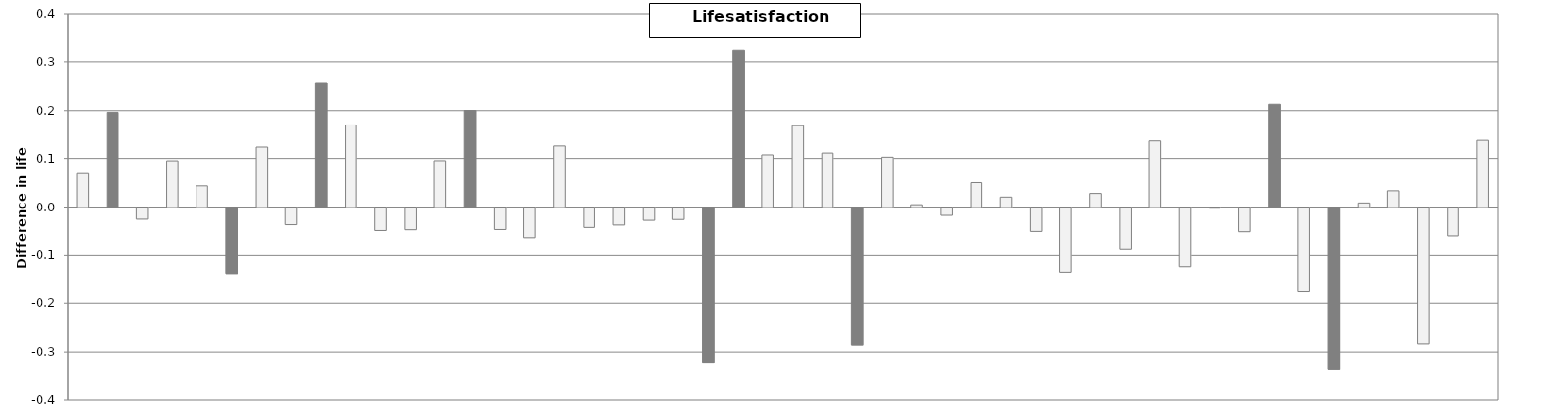
| Category | Difference in life satisfaction | Series 1 |
|---|---|---|
| Chinese Taipei | 0 | 0.07 |
| Korea | 0.197 | 0 |
| B-S-J-G (China) | 0 | -0.024 |
| Dominican Republic | 0 | 0.095 |
| Mexico | 0 | 0.044 |
| Qatar | -0.136 | 0 |
| Costa Rica | 0 | 0.124 |
| United States | 0 | -0.036 |
| Japan | 0.257 | 0 |
| Turkey | 0 | 0.17 |
| Thailand | 0 | -0.048 |
| Colombia | 0 | -0.046 |
| Spain | 0 | 0.095 |
| Peru | 0.2 | 0 |
| United Arab Emirates | 0 | -0.046 |
| Tunisia | 0 | -0.063 |
| Italy | 0 | 0.126 |
| Hong Kong (China) | 0 | -0.042 |
| Russia | 0 | -0.037 |
| Ireland | 0 | -0.027 |
| Croatia | 0 | -0.025 |
| Macao (China) | -0.32 | 0 |
| Greece | 0.324 | 0 |
| Portugal | 0 | 0.107 |
| Montenegro | 0 | 0.168 |
| Uruguay | 0 | 0.111 |
| United Kingdom | -0.284 | 0 |
| Brazil | 0 | 0.103 |
| OECD average | 0 | 0.005 |
| France | 0 | -0.016 |
| Slovenia | 0 | 0.051 |
| Bulgaria | 0 | 0.021 |
| Netherlands | 0 | -0.05 |
| Poland | 0 | -0.134 |
| Belgium (excl. Flemish) | 0 | 0.028 |
| Hungary | 0 | -0.086 |
| Lithuania | 0 | 0.137 |
| Slovak Republic | 0 | -0.122 |
| Chile | 0 | -0.001 |
| Finland | 0 | -0.05 |
| Austria | 0.213 | 0 |
| Estonia | 0 | -0.175 |
| Czech Republic | -0.334 | 0 |
| Luxembourg | 0 | 0.008 |
| Latvia | 0 | 0.034 |
| Iceland | 0 | -0.282 |
| Germany | 0 | -0.059 |
| Switzerland | 0 | 0.138 |